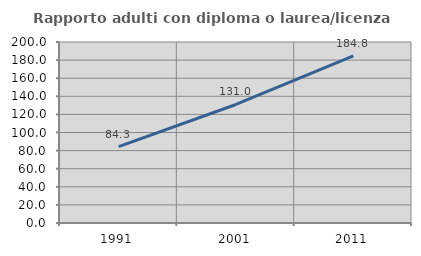
| Category | Rapporto adulti con diploma o laurea/licenza media  |
|---|---|
| 1991.0 | 84.315 |
| 2001.0 | 130.979 |
| 2011.0 | 184.774 |